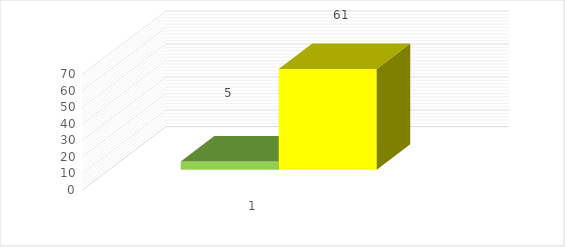
| Category | положительных |
|---|---|
| 0 | 61 |